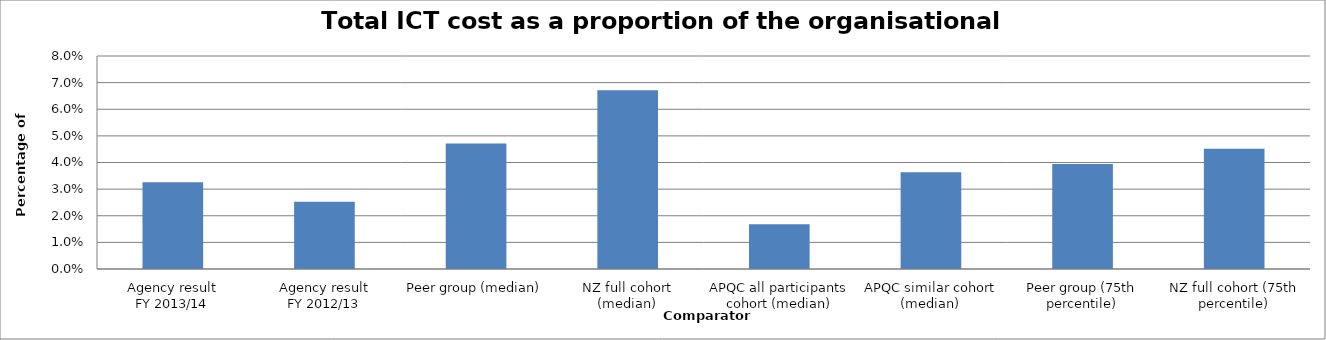
| Category | Result |
|---|---|
| Agency result
FY 2013/14 | 0.033 |
| Agency result
FY 2012/13 | 0.025 |
| Peer group (median) | 0.047 |
| NZ full cohort (median) | 0.067 |
| APQC all participants cohort (median) | 0.017 |
| APQC similar cohort (median) | 0.036 |
| Peer group (75th percentile) | 0.039 |
| NZ full cohort (75th percentile) | 0.045 |